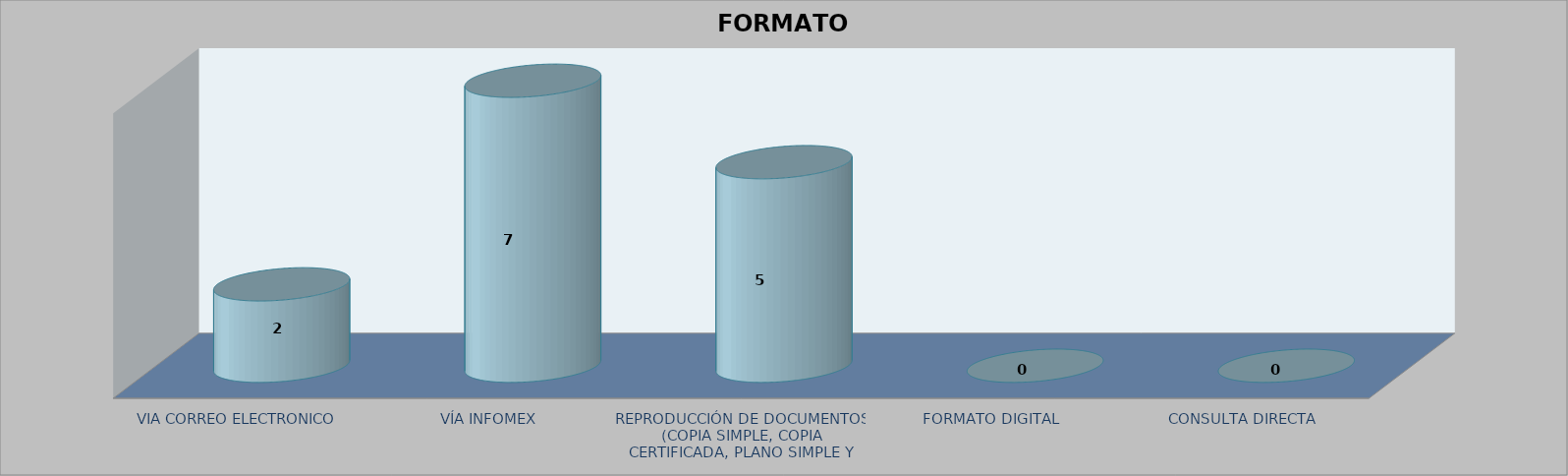
| Category |        FORMATO SOLICITADO | Series 1 | Series 2 |
|---|---|---|---|
| VIA CORREO ELECTRONICO |  |  | 2 |
| VÍA INFOMEX |  |  | 7 |
| REPRODUCCIÓN DE DOCUMENTOS (COPIA SIMPLE, COPIA CERTIFICADA, PLANO SIMPLE Y PLANO CERTIFICADO) |  |  | 5 |
| FORMATO DIGITAL |  |  | 0 |
| CONSULTA DIRECTA |  |  | 0 |